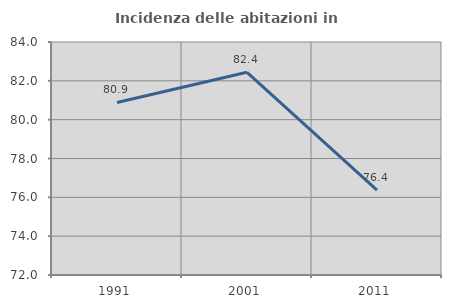
| Category | Incidenza delle abitazioni in proprietà  |
|---|---|
| 1991.0 | 80.886 |
| 2001.0 | 82.44 |
| 2011.0 | 76.376 |